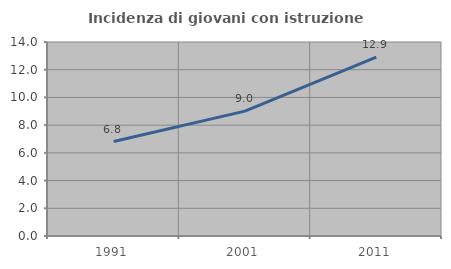
| Category | Incidenza di giovani con istruzione universitaria |
|---|---|
| 1991.0 | 6.818 |
| 2001.0 | 9.009 |
| 2011.0 | 12.903 |